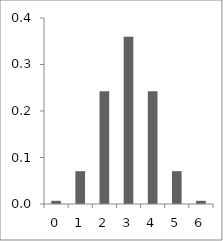
| Category | Series 0 |
|---|---|
| 0.0 | 0.007 |
| 1.0 | 0.071 |
| 2.0 | 0.243 |
| 3.0 | 0.36 |
| 4.0 | 0.243 |
| 5.0 | 0.071 |
| 6.0 | 0.007 |